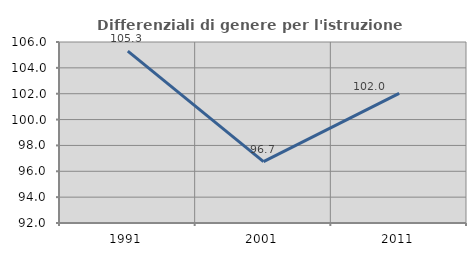
| Category | Differenziali di genere per l'istruzione superiore |
|---|---|
| 1991.0 | 105.292 |
| 2001.0 | 96.746 |
| 2011.0 | 102.032 |